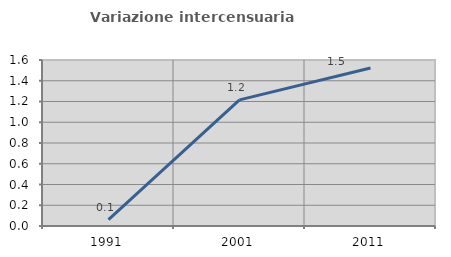
| Category | Variazione intercensuaria annua |
|---|---|
| 1991.0 | 0.061 |
| 2001.0 | 1.216 |
| 2011.0 | 1.522 |